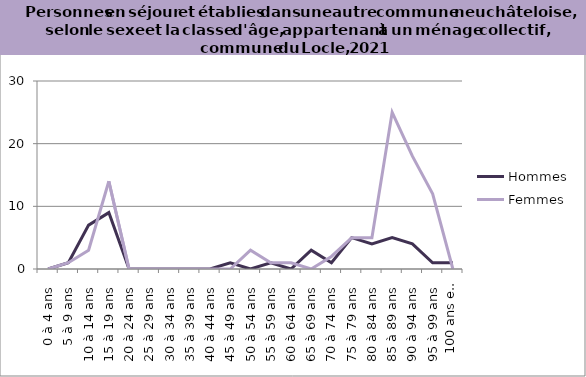
| Category | Hommes | Femmes |
|---|---|---|
| 0 à 4 ans | 0 | 0 |
| 5 à 9 ans | 1 | 1 |
| 10 à 14 ans | 7 | 3 |
| 15 à 19 ans | 9 | 14 |
| 20 à 24 ans | 0 | 0 |
| 25 à 29 ans | 0 | 0 |
| 30 à 34 ans | 0 | 0 |
| 35 à 39 ans | 0 | 0 |
| 40 à 44 ans | 0 | 0 |
| 45 à 49 ans | 1 | 0 |
| 50 à 54 ans | 0 | 3 |
| 55 à 59 ans | 1 | 1 |
| 60 à 64 ans | 0 | 1 |
| 65 à 69 ans | 3 | 0 |
| 70 à 74 ans | 1 | 2 |
| 75 à 79 ans | 5 | 5 |
| 80 à 84 ans | 4 | 5 |
| 85 à 89 ans | 5 | 25 |
| 90 à 94 ans | 4 | 18 |
| 95 à 99 ans | 1 | 12 |
| 100 ans et plus | 1 | 0 |